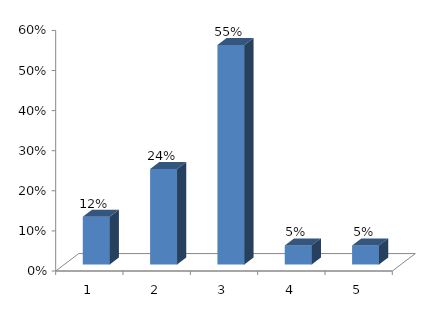
| Category | Series 0 |
|---|---|
| 0 | 0.119 |
| 1 | 0.238 |
| 2 | 0.548 |
| 3 | 0.048 |
| 4 | 0.048 |